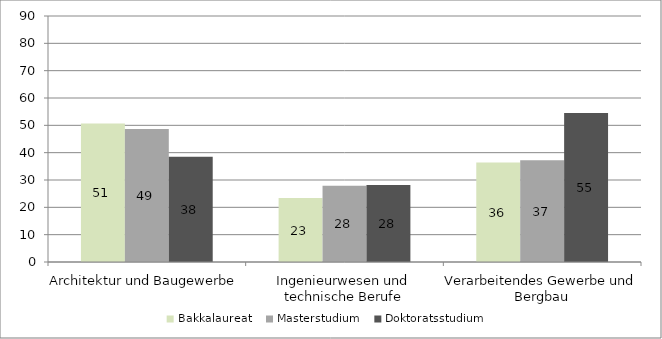
| Category | Bakkalaureat  | Masterstudium  | Doktoratsstudium  |
|---|---|---|---|
| Architektur und Baugewerbe | 50.679 | 48.651 | 38.462 |
| Ingenieurwesen und technische Berufe | 23.409 | 27.927 | 28.146 |
| Verarbeitendes Gewerbe und Bergbau | 36.364 | 37.241 | 54.545 |